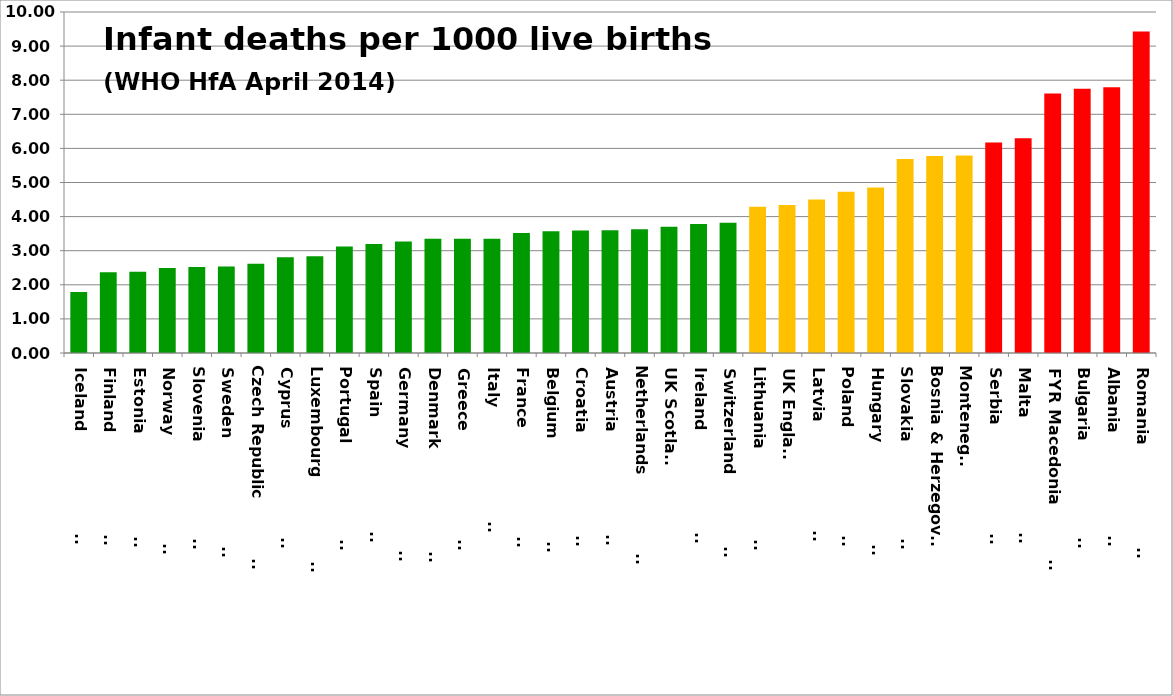
| Category | Series 0 |
|---|---|
| Iceland                       | 1.79 |
| Finland                       | 2.37 |
| Estonia                       | 2.38 |
| Norway                        | 2.49 |
| Slovenia                      | 2.52 |
| Sweden                        | 2.54 |
| Czech Republic                | 2.62 |
| Cyprus                        | 2.81 |
| Luxembourg                    | 2.84 |
| Portugal                      | 3.12 |
| Spain                         | 3.2 |
| Germany                       | 3.27 |
| Denmark                       | 3.35 |
| Greece                        | 3.35 |
| Italy                         | 3.35 |
| France                        | 3.52 |
| Belgium                       | 3.57 |
| Croatia                       | 3.59 |
| Austria                       | 3.6 |
| Netherlands                   | 3.63 |
| UK Scotland | 3.7 |
| Ireland                       | 3.78 |
| Switzerland                   | 3.82 |
| Lithuania                     | 4.29 |
| UK England | 4.34 |
| Latvia                        | 4.5 |
| Poland                        | 4.73 |
| Hungary                       | 4.85 |
| Slovakia                      | 5.69 |
| Bosnia & Herzegovina | 5.78 |
| Montenegro | 5.79 |
| Serbia                        | 6.17 |
| Malta                         | 6.3 |
| FYR Macedonia                | 7.61 |
| Bulgaria                      | 7.75 |
| Albania                       | 7.79 |
| Romania                       | 9.43 |